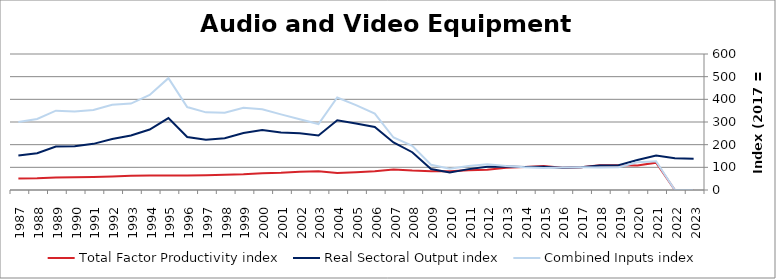
| Category | Total Factor Productivity index | Real Sectoral Output index | Combined Inputs index |
|---|---|---|---|
| 2023.0 | 0 | 137.686 | 0 |
| 2022.0 | 0 | 140.208 | 0 |
| 2021.0 | 120.649 | 152.494 | 126.395 |
| 2020.0 | 108.149 | 132.396 | 122.42 |
| 2019.0 | 109.168 | 109.139 | 99.973 |
| 2018.0 | 109.471 | 108.346 | 98.973 |
| 2017.0 | 100 | 100 | 100 |
| 2016.0 | 98.484 | 98.033 | 99.542 |
| 2015.0 | 105.619 | 102.54 | 97.085 |
| 2014.0 | 101.783 | 101.953 | 100.168 |
| 2013.0 | 98.011 | 103.379 | 105.477 |
| 2012.0 | 89.695 | 102.248 | 113.996 |
| 2011.0 | 86.825 | 92.067 | 106.038 |
| 2010.0 | 82.536 | 77.8 | 94.263 |
| 2009.0 | 82.896 | 92.198 | 111.22 |
| 2008.0 | 85.646 | 166.629 | 194.556 |
| 2007.0 | 90.598 | 209.692 | 231.454 |
| 2006.0 | 82.382 | 277.781 | 337.185 |
| 2005.0 | 78.385 | 293.509 | 374.445 |
| 2004.0 | 75.436 | 307.976 | 408.26 |
| 2003.0 | 82.663 | 240.597 | 291.058 |
| 2002.0 | 80.39 | 250.687 | 311.841 |
| 2001.0 | 75.982 | 253.398 | 333.497 |
| 2000.0 | 74.372 | 265.103 | 356.454 |
| 1999.0 | 69.134 | 251.141 | 363.265 |
| 1998.0 | 66.857 | 227.964 | 340.973 |
| 1997.0 | 64.829 | 222.106 | 342.6 |
| 1996.0 | 63.944 | 234.068 | 366.051 |
| 1995.0 | 64.277 | 317.227 | 493.533 |
| 1994.0 | 63.654 | 266.809 | 419.154 |
| 1993.0 | 63.034 | 240.253 | 381.149 |
| 1992.0 | 59.771 | 224.623 | 375.808 |
| 1991.0 | 57.671 | 203.574 | 352.993 |
| 1990.0 | 55.76 | 193.04 | 346.198 |
| 1989.0 | 54.757 | 191.583 | 349.878 |
| 1988.0 | 51.786 | 162.276 | 313.361 |
| 1987.0 | 50.755 | 152.225 | 299.923 |